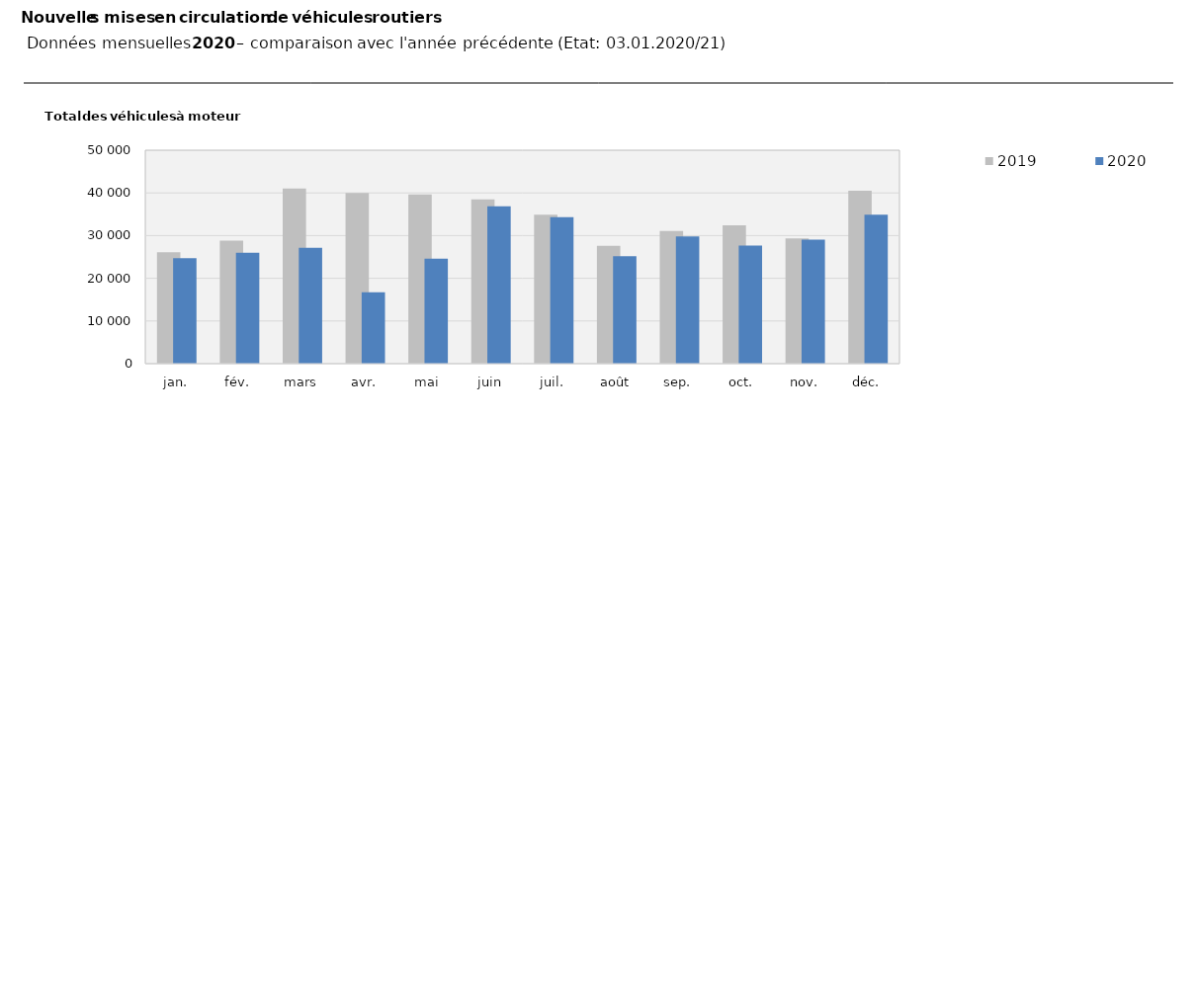
| Category | 2019 | 2020 |
|---|---|---|
| jan. | 26097 | 24708 |
| fév. | 28838 | 25962 |
| mars | 41038 | 27160 |
| avr. | 39963 | 16710 |
| mai | 39625 | 24572 |
| juin | 38458 | 36835 |
| juil. | 34896 | 34308 |
| août | 27632 | 25197 |
| sep. | 31087 | 29826 |
| oct. | 32408 | 27645 |
| nov. | 29327 | 29039 |
| déc. | 40507 | 34879 |